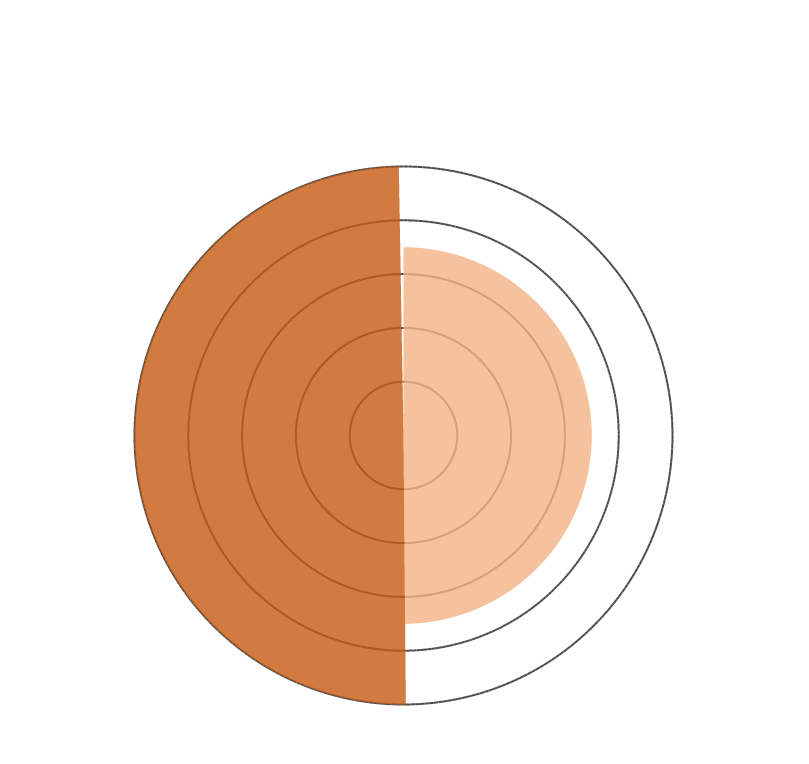
| Category | Lokale warmtevraag < 2 km | Lokale warmte-opwek < 2 km |
|---|---|---|
| 0 | 7 | 0 |
| 1 | 7 | 0 |
| 2 | 7 | 0 |
| 3 | 7 | 0 |
| 4 | 7 | 0 |
| 5 | 7 | 0 |
| 6 | 7 | 0 |
| 7 | 7 | 0 |
| 8 | 7 | 0 |
| 9 | 7 | 0 |
| 10 | 7 | 0 |
| 11 | 7 | 0 |
| 12 | 7 | 0 |
| 13 | 7 | 0 |
| 14 | 7 | 0 |
| 15 | 7 | 0 |
| 16 | 7 | 0 |
| 17 | 7 | 0 |
| 18 | 7 | 0 |
| 19 | 7 | 0 |
| 20 | 7 | 0 |
| 21 | 7 | 0 |
| 22 | 7 | 0 |
| 23 | 7 | 0 |
| 24 | 7 | 0 |
| 25 | 7 | 0 |
| 26 | 7 | 0 |
| 27 | 7 | 0 |
| 28 | 7 | 0 |
| 29 | 7 | 0 |
| 30 | 7 | 0 |
| 31 | 7 | 0 |
| 32 | 7 | 0 |
| 33 | 7 | 0 |
| 34 | 7 | 0 |
| 35 | 7 | 0 |
| 36 | 7 | 0 |
| 37 | 7 | 0 |
| 38 | 7 | 0 |
| 39 | 7 | 0 |
| 40 | 7 | 0 |
| 41 | 7 | 0 |
| 42 | 7 | 0 |
| 43 | 7 | 0 |
| 44 | 7 | 0 |
| 45 | 7 | 0 |
| 46 | 7 | 0 |
| 47 | 7 | 0 |
| 48 | 7 | 0 |
| 49 | 7 | 0 |
| 50 | 7 | 0 |
| 51 | 7 | 0 |
| 52 | 7 | 0 |
| 53 | 7 | 0 |
| 54 | 7 | 0 |
| 55 | 7 | 0 |
| 56 | 7 | 0 |
| 57 | 7 | 0 |
| 58 | 7 | 0 |
| 59 | 7 | 0 |
| 60 | 7 | 0 |
| 61 | 7 | 0 |
| 62 | 7 | 0 |
| 63 | 7 | 0 |
| 64 | 7 | 0 |
| 65 | 7 | 0 |
| 66 | 7 | 0 |
| 67 | 7 | 0 |
| 68 | 7 | 0 |
| 69 | 7 | 0 |
| 70 | 7 | 0 |
| 71 | 7 | 0 |
| 72 | 7 | 0 |
| 73 | 7 | 0 |
| 74 | 7 | 0 |
| 75 | 7 | 0 |
| 76 | 7 | 0 |
| 77 | 7 | 0 |
| 78 | 7 | 0 |
| 79 | 7 | 0 |
| 80 | 7 | 0 |
| 81 | 7 | 0 |
| 82 | 7 | 0 |
| 83 | 7 | 0 |
| 84 | 7 | 0 |
| 85 | 7 | 0 |
| 86 | 7 | 0 |
| 87 | 7 | 0 |
| 88 | 7 | 0 |
| 89 | 7 | 0 |
| 90 | 7 | 0 |
| 91 | 7 | 0 |
| 92 | 7 | 0 |
| 93 | 7 | 0 |
| 94 | 7 | 0 |
| 95 | 7 | 0 |
| 96 | 7 | 0 |
| 97 | 7 | 0 |
| 98 | 7 | 0 |
| 99 | 7 | 0 |
| 100 | 7 | 0 |
| 101 | 7 | 0 |
| 102 | 7 | 0 |
| 103 | 7 | 0 |
| 104 | 7 | 0 |
| 105 | 7 | 0 |
| 106 | 7 | 0 |
| 107 | 7 | 0 |
| 108 | 7 | 0 |
| 109 | 7 | 0 |
| 110 | 7 | 0 |
| 111 | 7 | 0 |
| 112 | 7 | 0 |
| 113 | 7 | 0 |
| 114 | 7 | 0 |
| 115 | 7 | 0 |
| 116 | 7 | 0 |
| 117 | 7 | 0 |
| 118 | 7 | 0 |
| 119 | 7 | 0 |
| 120 | 7 | 0 |
| 121 | 7 | 0 |
| 122 | 7 | 0 |
| 123 | 7 | 0 |
| 124 | 7 | 0 |
| 125 | 7 | 0 |
| 126 | 7 | 0 |
| 127 | 7 | 0 |
| 128 | 7 | 0 |
| 129 | 7 | 0 |
| 130 | 7 | 0 |
| 131 | 7 | 0 |
| 132 | 7 | 0 |
| 133 | 7 | 0 |
| 134 | 7 | 0 |
| 135 | 7 | 0 |
| 136 | 7 | 0 |
| 137 | 7 | 0 |
| 138 | 7 | 0 |
| 139 | 7 | 0 |
| 140 | 7 | 0 |
| 141 | 7 | 0 |
| 142 | 7 | 0 |
| 143 | 7 | 0 |
| 144 | 7 | 0 |
| 145 | 7 | 0 |
| 146 | 7 | 0 |
| 147 | 7 | 0 |
| 148 | 7 | 0 |
| 149 | 7 | 0 |
| 150 | 7 | 0 |
| 151 | 7 | 0 |
| 152 | 7 | 0 |
| 153 | 7 | 0 |
| 154 | 7 | 0 |
| 155 | 7 | 0 |
| 156 | 7 | 0 |
| 157 | 7 | 0 |
| 158 | 7 | 0 |
| 159 | 7 | 0 |
| 160 | 7 | 0 |
| 161 | 7 | 0 |
| 162 | 7 | 0 |
| 163 | 7 | 0 |
| 164 | 7 | 0 |
| 165 | 7 | 0 |
| 166 | 7 | 0 |
| 167 | 7 | 0 |
| 168 | 7 | 0 |
| 169 | 7 | 0 |
| 170 | 7 | 0 |
| 171 | 7 | 0 |
| 172 | 7 | 0 |
| 173 | 7 | 0 |
| 174 | 7 | 0 |
| 175 | 7 | 0 |
| 176 | 7 | 0 |
| 177 | 7 | 0 |
| 178 | 7 | 0 |
| 179 | 7 | 0 |
| 180 | 7 | 0 |
| 181 | 0 | 0 |
| 182 | 0 | 0 |
| 183 | 0 | 0 |
| 184 | 0 | 0 |
| 185 | 0 | 0 |
| 186 | 0 | 0 |
| 187 | 0 | 0 |
| 188 | 0 | 0 |
| 189 | 0 | 0 |
| 190 | 0 | 0 |
| 191 | 0 | 0 |
| 192 | 0 | 0 |
| 193 | 0 | 0 |
| 194 | 0 | 0 |
| 195 | 0 | 0 |
| 196 | 0 | 0 |
| 197 | 0 | 0 |
| 198 | 0 | 0 |
| 199 | 0 | 0 |
| 200 | 0 | 0 |
| 201 | 0 | 0 |
| 202 | 0 | 0 |
| 203 | 0 | 0 |
| 204 | 0 | 0 |
| 205 | 0 | 0 |
| 206 | 0 | 0 |
| 207 | 0 | 0 |
| 208 | 0 | 0 |
| 209 | 0 | 0 |
| 210 | 0 | 0 |
| 211 | 0 | 0 |
| 212 | 0 | 0 |
| 213 | 0 | 0 |
| 214 | 0 | 0 |
| 215 | 0 | 0 |
| 216 | 0 | 0 |
| 217 | 0 | 0 |
| 218 | 0 | 0 |
| 219 | 0 | 0 |
| 220 | 0 | 0 |
| 221 | 0 | 0 |
| 222 | 0 | 0 |
| 223 | 0 | 0 |
| 224 | 0 | 0 |
| 225 | 0 | 0 |
| 226 | 0 | 0 |
| 227 | 0 | 0 |
| 228 | 0 | 0 |
| 229 | 0 | 0 |
| 230 | 0 | 0 |
| 231 | 0 | 0 |
| 232 | 0 | 0 |
| 233 | 0 | 0 |
| 234 | 0 | 0 |
| 235 | 0 | 0 |
| 236 | 0 | 0 |
| 237 | 0 | 0 |
| 238 | 0 | 0 |
| 239 | 0 | 0 |
| 240 | 0 | 0 |
| 241 | 0 | 0 |
| 242 | 0 | 0 |
| 243 | 0 | 0 |
| 244 | 0 | 0 |
| 245 | 0 | 0 |
| 246 | 0 | 0 |
| 247 | 0 | 0 |
| 248 | 0 | 0 |
| 249 | 0 | 0 |
| 250 | 0 | 0 |
| 251 | 0 | 0 |
| 252 | 0 | 0 |
| 253 | 0 | 0 |
| 254 | 0 | 0 |
| 255 | 0 | 0 |
| 256 | 0 | 0 |
| 257 | 0 | 0 |
| 258 | 0 | 0 |
| 259 | 0 | 0 |
| 260 | 0 | 0 |
| 261 | 0 | 0 |
| 262 | 0 | 0 |
| 263 | 0 | 0 |
| 264 | 0 | 0 |
| 265 | 0 | 0 |
| 266 | 0 | 0 |
| 267 | 0 | 0 |
| 268 | 0 | 0 |
| 269 | 0 | 0 |
| 270 | 0 | 0 |
| 271 | 0 | 0 |
| 272 | 0 | 0 |
| 273 | 0 | 0 |
| 274 | 0 | 0 |
| 275 | 0 | 0 |
| 276 | 0 | 0 |
| 277 | 0 | 0 |
| 278 | 0 | 0 |
| 279 | 0 | 0 |
| 280 | 0 | 0 |
| 281 | 0 | 0 |
| 282 | 0 | 0 |
| 283 | 0 | 0 |
| 284 | 0 | 0 |
| 285 | 0 | 0 |
| 286 | 0 | 0 |
| 287 | 0 | 0 |
| 288 | 0 | 0 |
| 289 | 0 | 0 |
| 290 | 0 | 0 |
| 291 | 0 | 0 |
| 292 | 0 | 0 |
| 293 | 0 | 0 |
| 294 | 0 | 0 |
| 295 | 0 | 0 |
| 296 | 0 | 0 |
| 297 | 0 | 0 |
| 298 | 0 | 0 |
| 299 | 0 | 0 |
| 300 | 0 | 0 |
| 301 | 0 | 0 |
| 302 | 0 | 0 |
| 303 | 0 | 0 |
| 304 | 0 | 0 |
| 305 | 0 | 0 |
| 306 | 0 | 0 |
| 307 | 0 | 0 |
| 308 | 0 | 0 |
| 309 | 0 | 0 |
| 310 | 0 | 0 |
| 311 | 0 | 0 |
| 312 | 0 | 0 |
| 313 | 0 | 0 |
| 314 | 0 | 0 |
| 315 | 0 | 0 |
| 316 | 0 | 0 |
| 317 | 0 | 0 |
| 318 | 0 | 0 |
| 319 | 0 | 0 |
| 320 | 0 | 0 |
| 321 | 0 | 0 |
| 322 | 0 | 0 |
| 323 | 0 | 0 |
| 324 | 0 | 0 |
| 325 | 0 | 0 |
| 326 | 0 | 0 |
| 327 | 0 | 0 |
| 328 | 0 | 0 |
| 329 | 0 | 0 |
| 330 | 0 | 0 |
| 331 | 0 | 0 |
| 332 | 0 | 0 |
| 333 | 0 | 0 |
| 334 | 0 | 0 |
| 335 | 0 | 0 |
| 336 | 0 | 0 |
| 337 | 0 | 0 |
| 338 | 0 | 0 |
| 339 | 0 | 0 |
| 340 | 0 | 0 |
| 341 | 0 | 0 |
| 342 | 0 | 0 |
| 343 | 0 | 0 |
| 344 | 0 | 0 |
| 345 | 0 | 0 |
| 346 | 0 | 0 |
| 347 | 0 | 0 |
| 348 | 0 | 0 |
| 349 | 0 | 0 |
| 350 | 0 | 0 |
| 351 | 0 | 0 |
| 352 | 0 | 0 |
| 353 | 0 | 0 |
| 354 | 0 | 0 |
| 355 | 0 | 0 |
| 356 | 0 | 0 |
| 357 | 0 | 0 |
| 358 | 0 | 0 |
| 359 | 0 | 0 |
| 360 | 0 | 10 |